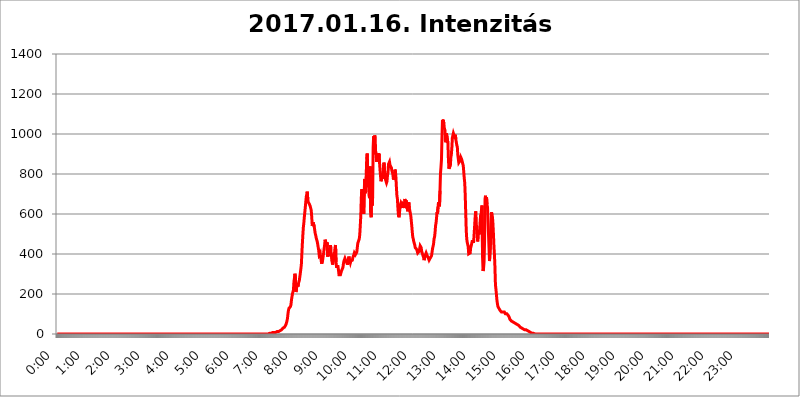
| Category | 2017.01.16. Intenzitás [W/m^2] |
|---|---|
| 0.0 | 0 |
| 0.0006944444444444445 | 0 |
| 0.001388888888888889 | 0 |
| 0.0020833333333333333 | 0 |
| 0.002777777777777778 | 0 |
| 0.003472222222222222 | 0 |
| 0.004166666666666667 | 0 |
| 0.004861111111111111 | 0 |
| 0.005555555555555556 | 0 |
| 0.0062499999999999995 | 0 |
| 0.006944444444444444 | 0 |
| 0.007638888888888889 | 0 |
| 0.008333333333333333 | 0 |
| 0.009027777777777779 | 0 |
| 0.009722222222222222 | 0 |
| 0.010416666666666666 | 0 |
| 0.011111111111111112 | 0 |
| 0.011805555555555555 | 0 |
| 0.012499999999999999 | 0 |
| 0.013194444444444444 | 0 |
| 0.013888888888888888 | 0 |
| 0.014583333333333332 | 0 |
| 0.015277777777777777 | 0 |
| 0.015972222222222224 | 0 |
| 0.016666666666666666 | 0 |
| 0.017361111111111112 | 0 |
| 0.018055555555555557 | 0 |
| 0.01875 | 0 |
| 0.019444444444444445 | 0 |
| 0.02013888888888889 | 0 |
| 0.020833333333333332 | 0 |
| 0.02152777777777778 | 0 |
| 0.022222222222222223 | 0 |
| 0.02291666666666667 | 0 |
| 0.02361111111111111 | 0 |
| 0.024305555555555556 | 0 |
| 0.024999999999999998 | 0 |
| 0.025694444444444447 | 0 |
| 0.02638888888888889 | 0 |
| 0.027083333333333334 | 0 |
| 0.027777777777777776 | 0 |
| 0.02847222222222222 | 0 |
| 0.029166666666666664 | 0 |
| 0.029861111111111113 | 0 |
| 0.030555555555555555 | 0 |
| 0.03125 | 0 |
| 0.03194444444444445 | 0 |
| 0.03263888888888889 | 0 |
| 0.03333333333333333 | 0 |
| 0.034027777777777775 | 0 |
| 0.034722222222222224 | 0 |
| 0.035416666666666666 | 0 |
| 0.036111111111111115 | 0 |
| 0.03680555555555556 | 0 |
| 0.0375 | 0 |
| 0.03819444444444444 | 0 |
| 0.03888888888888889 | 0 |
| 0.03958333333333333 | 0 |
| 0.04027777777777778 | 0 |
| 0.04097222222222222 | 0 |
| 0.041666666666666664 | 0 |
| 0.042361111111111106 | 0 |
| 0.04305555555555556 | 0 |
| 0.043750000000000004 | 0 |
| 0.044444444444444446 | 0 |
| 0.04513888888888889 | 0 |
| 0.04583333333333334 | 0 |
| 0.04652777777777778 | 0 |
| 0.04722222222222222 | 0 |
| 0.04791666666666666 | 0 |
| 0.04861111111111111 | 0 |
| 0.049305555555555554 | 0 |
| 0.049999999999999996 | 0 |
| 0.05069444444444445 | 0 |
| 0.051388888888888894 | 0 |
| 0.052083333333333336 | 0 |
| 0.05277777777777778 | 0 |
| 0.05347222222222222 | 0 |
| 0.05416666666666667 | 0 |
| 0.05486111111111111 | 0 |
| 0.05555555555555555 | 0 |
| 0.05625 | 0 |
| 0.05694444444444444 | 0 |
| 0.057638888888888885 | 0 |
| 0.05833333333333333 | 0 |
| 0.05902777777777778 | 0 |
| 0.059722222222222225 | 0 |
| 0.06041666666666667 | 0 |
| 0.061111111111111116 | 0 |
| 0.06180555555555556 | 0 |
| 0.0625 | 0 |
| 0.06319444444444444 | 0 |
| 0.06388888888888888 | 0 |
| 0.06458333333333334 | 0 |
| 0.06527777777777778 | 0 |
| 0.06597222222222222 | 0 |
| 0.06666666666666667 | 0 |
| 0.06736111111111111 | 0 |
| 0.06805555555555555 | 0 |
| 0.06874999999999999 | 0 |
| 0.06944444444444443 | 0 |
| 0.07013888888888889 | 0 |
| 0.07083333333333333 | 0 |
| 0.07152777777777779 | 0 |
| 0.07222222222222223 | 0 |
| 0.07291666666666667 | 0 |
| 0.07361111111111111 | 0 |
| 0.07430555555555556 | 0 |
| 0.075 | 0 |
| 0.07569444444444444 | 0 |
| 0.0763888888888889 | 0 |
| 0.07708333333333334 | 0 |
| 0.07777777777777778 | 0 |
| 0.07847222222222222 | 0 |
| 0.07916666666666666 | 0 |
| 0.0798611111111111 | 0 |
| 0.08055555555555556 | 0 |
| 0.08125 | 0 |
| 0.08194444444444444 | 0 |
| 0.08263888888888889 | 0 |
| 0.08333333333333333 | 0 |
| 0.08402777777777777 | 0 |
| 0.08472222222222221 | 0 |
| 0.08541666666666665 | 0 |
| 0.08611111111111112 | 0 |
| 0.08680555555555557 | 0 |
| 0.08750000000000001 | 0 |
| 0.08819444444444445 | 0 |
| 0.08888888888888889 | 0 |
| 0.08958333333333333 | 0 |
| 0.09027777777777778 | 0 |
| 0.09097222222222222 | 0 |
| 0.09166666666666667 | 0 |
| 0.09236111111111112 | 0 |
| 0.09305555555555556 | 0 |
| 0.09375 | 0 |
| 0.09444444444444444 | 0 |
| 0.09513888888888888 | 0 |
| 0.09583333333333333 | 0 |
| 0.09652777777777777 | 0 |
| 0.09722222222222222 | 0 |
| 0.09791666666666667 | 0 |
| 0.09861111111111111 | 0 |
| 0.09930555555555555 | 0 |
| 0.09999999999999999 | 0 |
| 0.10069444444444443 | 0 |
| 0.1013888888888889 | 0 |
| 0.10208333333333335 | 0 |
| 0.10277777777777779 | 0 |
| 0.10347222222222223 | 0 |
| 0.10416666666666667 | 0 |
| 0.10486111111111111 | 0 |
| 0.10555555555555556 | 0 |
| 0.10625 | 0 |
| 0.10694444444444444 | 0 |
| 0.1076388888888889 | 0 |
| 0.10833333333333334 | 0 |
| 0.10902777777777778 | 0 |
| 0.10972222222222222 | 0 |
| 0.1111111111111111 | 0 |
| 0.11180555555555556 | 0 |
| 0.11180555555555556 | 0 |
| 0.1125 | 0 |
| 0.11319444444444444 | 0 |
| 0.11388888888888889 | 0 |
| 0.11458333333333333 | 0 |
| 0.11527777777777777 | 0 |
| 0.11597222222222221 | 0 |
| 0.11666666666666665 | 0 |
| 0.1173611111111111 | 0 |
| 0.11805555555555557 | 0 |
| 0.11944444444444445 | 0 |
| 0.12013888888888889 | 0 |
| 0.12083333333333333 | 0 |
| 0.12152777777777778 | 0 |
| 0.12222222222222223 | 0 |
| 0.12291666666666667 | 0 |
| 0.12291666666666667 | 0 |
| 0.12361111111111112 | 0 |
| 0.12430555555555556 | 0 |
| 0.125 | 0 |
| 0.12569444444444444 | 0 |
| 0.12638888888888888 | 0 |
| 0.12708333333333333 | 0 |
| 0.16875 | 0 |
| 0.12847222222222224 | 0 |
| 0.12916666666666668 | 0 |
| 0.12986111111111112 | 0 |
| 0.13055555555555556 | 0 |
| 0.13125 | 0 |
| 0.13194444444444445 | 0 |
| 0.1326388888888889 | 0 |
| 0.13333333333333333 | 0 |
| 0.13402777777777777 | 0 |
| 0.13402777777777777 | 0 |
| 0.13472222222222222 | 0 |
| 0.13541666666666666 | 0 |
| 0.1361111111111111 | 0 |
| 0.13749999999999998 | 0 |
| 0.13819444444444443 | 0 |
| 0.1388888888888889 | 0 |
| 0.13958333333333334 | 0 |
| 0.14027777777777778 | 0 |
| 0.14097222222222222 | 0 |
| 0.14166666666666666 | 0 |
| 0.1423611111111111 | 0 |
| 0.14305555555555557 | 0 |
| 0.14375000000000002 | 0 |
| 0.14444444444444446 | 0 |
| 0.1451388888888889 | 0 |
| 0.1451388888888889 | 0 |
| 0.14652777777777778 | 0 |
| 0.14722222222222223 | 0 |
| 0.14791666666666667 | 0 |
| 0.1486111111111111 | 0 |
| 0.14930555555555555 | 0 |
| 0.15 | 0 |
| 0.15069444444444444 | 0 |
| 0.15138888888888888 | 0 |
| 0.15208333333333332 | 0 |
| 0.15277777777777776 | 0 |
| 0.15347222222222223 | 0 |
| 0.15416666666666667 | 0 |
| 0.15486111111111112 | 0 |
| 0.15555555555555556 | 0 |
| 0.15625 | 0 |
| 0.15694444444444444 | 0 |
| 0.15763888888888888 | 0 |
| 0.15833333333333333 | 0 |
| 0.15902777777777777 | 0 |
| 0.15972222222222224 | 0 |
| 0.16041666666666668 | 0 |
| 0.16111111111111112 | 0 |
| 0.16180555555555556 | 0 |
| 0.1625 | 0 |
| 0.16319444444444445 | 0 |
| 0.1638888888888889 | 0 |
| 0.16458333333333333 | 0 |
| 0.16527777777777777 | 0 |
| 0.16597222222222222 | 0 |
| 0.16666666666666666 | 0 |
| 0.1673611111111111 | 0 |
| 0.16805555555555554 | 0 |
| 0.16874999999999998 | 0 |
| 0.16944444444444443 | 0 |
| 0.17013888888888887 | 0 |
| 0.1708333333333333 | 0 |
| 0.17152777777777775 | 0 |
| 0.17222222222222225 | 0 |
| 0.1729166666666667 | 0 |
| 0.17361111111111113 | 0 |
| 0.17430555555555557 | 0 |
| 0.17500000000000002 | 0 |
| 0.17569444444444446 | 0 |
| 0.1763888888888889 | 0 |
| 0.17708333333333334 | 0 |
| 0.17777777777777778 | 0 |
| 0.17847222222222223 | 0 |
| 0.17916666666666667 | 0 |
| 0.1798611111111111 | 0 |
| 0.18055555555555555 | 0 |
| 0.18125 | 0 |
| 0.18194444444444444 | 0 |
| 0.1826388888888889 | 0 |
| 0.18333333333333335 | 0 |
| 0.1840277777777778 | 0 |
| 0.18472222222222223 | 0 |
| 0.18541666666666667 | 0 |
| 0.18611111111111112 | 0 |
| 0.18680555555555556 | 0 |
| 0.1875 | 0 |
| 0.18819444444444444 | 0 |
| 0.18888888888888888 | 0 |
| 0.18958333333333333 | 0 |
| 0.19027777777777777 | 0 |
| 0.1909722222222222 | 0 |
| 0.19166666666666665 | 0 |
| 0.19236111111111112 | 0 |
| 0.19305555555555554 | 0 |
| 0.19375 | 0 |
| 0.19444444444444445 | 0 |
| 0.1951388888888889 | 0 |
| 0.19583333333333333 | 0 |
| 0.19652777777777777 | 0 |
| 0.19722222222222222 | 0 |
| 0.19791666666666666 | 0 |
| 0.1986111111111111 | 0 |
| 0.19930555555555554 | 0 |
| 0.19999999999999998 | 0 |
| 0.20069444444444443 | 0 |
| 0.20138888888888887 | 0 |
| 0.2020833333333333 | 0 |
| 0.2027777777777778 | 0 |
| 0.2034722222222222 | 0 |
| 0.2041666666666667 | 0 |
| 0.20486111111111113 | 0 |
| 0.20555555555555557 | 0 |
| 0.20625000000000002 | 0 |
| 0.20694444444444446 | 0 |
| 0.2076388888888889 | 0 |
| 0.20833333333333334 | 0 |
| 0.20902777777777778 | 0 |
| 0.20972222222222223 | 0 |
| 0.21041666666666667 | 0 |
| 0.2111111111111111 | 0 |
| 0.21180555555555555 | 0 |
| 0.2125 | 0 |
| 0.21319444444444444 | 0 |
| 0.2138888888888889 | 0 |
| 0.21458333333333335 | 0 |
| 0.2152777777777778 | 0 |
| 0.21597222222222223 | 0 |
| 0.21666666666666667 | 0 |
| 0.21736111111111112 | 0 |
| 0.21805555555555556 | 0 |
| 0.21875 | 0 |
| 0.21944444444444444 | 0 |
| 0.22013888888888888 | 0 |
| 0.22083333333333333 | 0 |
| 0.22152777777777777 | 0 |
| 0.2222222222222222 | 0 |
| 0.22291666666666665 | 0 |
| 0.2236111111111111 | 0 |
| 0.22430555555555556 | 0 |
| 0.225 | 0 |
| 0.22569444444444445 | 0 |
| 0.2263888888888889 | 0 |
| 0.22708333333333333 | 0 |
| 0.22777777777777777 | 0 |
| 0.22847222222222222 | 0 |
| 0.22916666666666666 | 0 |
| 0.2298611111111111 | 0 |
| 0.23055555555555554 | 0 |
| 0.23124999999999998 | 0 |
| 0.23194444444444443 | 0 |
| 0.23263888888888887 | 0 |
| 0.2333333333333333 | 0 |
| 0.2340277777777778 | 0 |
| 0.2347222222222222 | 0 |
| 0.2354166666666667 | 0 |
| 0.23611111111111113 | 0 |
| 0.23680555555555557 | 0 |
| 0.23750000000000002 | 0 |
| 0.23819444444444446 | 0 |
| 0.2388888888888889 | 0 |
| 0.23958333333333334 | 0 |
| 0.24027777777777778 | 0 |
| 0.24097222222222223 | 0 |
| 0.24166666666666667 | 0 |
| 0.2423611111111111 | 0 |
| 0.24305555555555555 | 0 |
| 0.24375 | 0 |
| 0.24444444444444446 | 0 |
| 0.24513888888888888 | 0 |
| 0.24583333333333335 | 0 |
| 0.2465277777777778 | 0 |
| 0.24722222222222223 | 0 |
| 0.24791666666666667 | 0 |
| 0.24861111111111112 | 0 |
| 0.24930555555555556 | 0 |
| 0.25 | 0 |
| 0.25069444444444444 | 0 |
| 0.2513888888888889 | 0 |
| 0.2520833333333333 | 0 |
| 0.25277777777777777 | 0 |
| 0.2534722222222222 | 0 |
| 0.25416666666666665 | 0 |
| 0.2548611111111111 | 0 |
| 0.2555555555555556 | 0 |
| 0.25625000000000003 | 0 |
| 0.2569444444444445 | 0 |
| 0.2576388888888889 | 0 |
| 0.25833333333333336 | 0 |
| 0.2590277777777778 | 0 |
| 0.25972222222222224 | 0 |
| 0.2604166666666667 | 0 |
| 0.2611111111111111 | 0 |
| 0.26180555555555557 | 0 |
| 0.2625 | 0 |
| 0.26319444444444445 | 0 |
| 0.2638888888888889 | 0 |
| 0.26458333333333334 | 0 |
| 0.2652777777777778 | 0 |
| 0.2659722222222222 | 0 |
| 0.26666666666666666 | 0 |
| 0.2673611111111111 | 0 |
| 0.26805555555555555 | 0 |
| 0.26875 | 0 |
| 0.26944444444444443 | 0 |
| 0.2701388888888889 | 0 |
| 0.2708333333333333 | 0 |
| 0.27152777777777776 | 0 |
| 0.2722222222222222 | 0 |
| 0.27291666666666664 | 0 |
| 0.2736111111111111 | 0 |
| 0.2743055555555555 | 0 |
| 0.27499999999999997 | 0 |
| 0.27569444444444446 | 0 |
| 0.27638888888888885 | 0 |
| 0.27708333333333335 | 0 |
| 0.2777777777777778 | 0 |
| 0.27847222222222223 | 0 |
| 0.2791666666666667 | 0 |
| 0.2798611111111111 | 0 |
| 0.28055555555555556 | 0 |
| 0.28125 | 0 |
| 0.28194444444444444 | 0 |
| 0.2826388888888889 | 0 |
| 0.2833333333333333 | 0 |
| 0.28402777777777777 | 0 |
| 0.2847222222222222 | 0 |
| 0.28541666666666665 | 0 |
| 0.28611111111111115 | 0 |
| 0.28680555555555554 | 0 |
| 0.28750000000000003 | 0 |
| 0.2881944444444445 | 0 |
| 0.2888888888888889 | 0 |
| 0.28958333333333336 | 0 |
| 0.2902777777777778 | 0 |
| 0.29097222222222224 | 0 |
| 0.2916666666666667 | 0 |
| 0.2923611111111111 | 0 |
| 0.29305555555555557 | 0 |
| 0.29375 | 0 |
| 0.29444444444444445 | 0 |
| 0.2951388888888889 | 0 |
| 0.29583333333333334 | 0 |
| 0.2965277777777778 | 3.525 |
| 0.2972222222222222 | 3.525 |
| 0.29791666666666666 | 3.525 |
| 0.2986111111111111 | 3.525 |
| 0.29930555555555555 | 3.525 |
| 0.3 | 3.525 |
| 0.30069444444444443 | 3.525 |
| 0.3013888888888889 | 3.525 |
| 0.3020833333333333 | 7.887 |
| 0.30277777777777776 | 7.887 |
| 0.3034722222222222 | 7.887 |
| 0.30416666666666664 | 7.887 |
| 0.3048611111111111 | 7.887 |
| 0.3055555555555555 | 7.887 |
| 0.30624999999999997 | 7.887 |
| 0.3069444444444444 | 12.257 |
| 0.3076388888888889 | 12.257 |
| 0.30833333333333335 | 12.257 |
| 0.3090277777777778 | 12.257 |
| 0.30972222222222223 | 12.257 |
| 0.3104166666666667 | 12.257 |
| 0.3111111111111111 | 12.257 |
| 0.31180555555555556 | 12.257 |
| 0.3125 | 16.636 |
| 0.31319444444444444 | 16.636 |
| 0.3138888888888889 | 16.636 |
| 0.3145833333333333 | 21.024 |
| 0.31527777777777777 | 21.024 |
| 0.3159722222222222 | 25.419 |
| 0.31666666666666665 | 29.823 |
| 0.31736111111111115 | 29.823 |
| 0.31805555555555554 | 29.823 |
| 0.31875000000000003 | 34.234 |
| 0.3194444444444445 | 38.653 |
| 0.3201388888888889 | 38.653 |
| 0.32083333333333336 | 47.511 |
| 0.3215277777777778 | 56.398 |
| 0.32222222222222224 | 65.31 |
| 0.3229166666666667 | 78.722 |
| 0.3236111111111111 | 101.184 |
| 0.32430555555555557 | 119.235 |
| 0.325 | 128.284 |
| 0.32569444444444445 | 128.284 |
| 0.3263888888888889 | 128.284 |
| 0.32708333333333334 | 137.347 |
| 0.3277777777777778 | 146.423 |
| 0.3284722222222222 | 169.156 |
| 0.32916666666666666 | 173.709 |
| 0.3298611111111111 | 201.058 |
| 0.33055555555555555 | 201.058 |
| 0.33125 | 219.309 |
| 0.33194444444444443 | 260.373 |
| 0.3326388888888889 | 278.603 |
| 0.3333333333333333 | 301.354 |
| 0.3340277777777778 | 283.156 |
| 0.3347222222222222 | 210.182 |
| 0.3354166666666667 | 219.309 |
| 0.3361111111111111 | 242.127 |
| 0.3368055555555556 | 251.251 |
| 0.33749999999999997 | 237.564 |
| 0.33819444444444446 | 251.251 |
| 0.33888888888888885 | 255.813 |
| 0.33958333333333335 | 269.49 |
| 0.34027777777777773 | 287.709 |
| 0.34097222222222223 | 305.898 |
| 0.3416666666666666 | 301.354 |
| 0.3423611111111111 | 346.682 |
| 0.3430555555555555 | 400.638 |
| 0.34375 | 449.551 |
| 0.3444444444444445 | 493.475 |
| 0.3451388888888889 | 532.513 |
| 0.3458333333333334 | 553.986 |
| 0.34652777777777777 | 583.779 |
| 0.34722222222222227 | 609.062 |
| 0.34791666666666665 | 634.105 |
| 0.34861111111111115 | 663.019 |
| 0.34930555555555554 | 687.544 |
| 0.35000000000000003 | 699.717 |
| 0.3506944444444444 | 711.832 |
| 0.3513888888888889 | 671.22 |
| 0.3520833333333333 | 658.909 |
| 0.3527777777777778 | 663.019 |
| 0.3534722222222222 | 650.667 |
| 0.3541666666666667 | 650.667 |
| 0.3548611111111111 | 638.256 |
| 0.35555555555555557 | 634.105 |
| 0.35625 | 617.436 |
| 0.35694444444444445 | 583.779 |
| 0.3576388888888889 | 541.121 |
| 0.35833333333333334 | 549.704 |
| 0.3590277777777778 | 558.261 |
| 0.3597222222222222 | 553.986 |
| 0.36041666666666666 | 536.82 |
| 0.3611111111111111 | 532.513 |
| 0.36180555555555555 | 502.192 |
| 0.3625 | 493.475 |
| 0.36319444444444443 | 480.356 |
| 0.3638888888888889 | 475.972 |
| 0.3645833333333333 | 462.786 |
| 0.3652777777777778 | 449.551 |
| 0.3659722222222222 | 445.129 |
| 0.3666666666666667 | 418.492 |
| 0.3673611111111111 | 396.164 |
| 0.3680555555555556 | 400.638 |
| 0.36874999999999997 | 405.108 |
| 0.36944444444444446 | 382.715 |
| 0.37013888888888885 | 369.23 |
| 0.37083333333333335 | 351.198 |
| 0.37152777777777773 | 355.712 |
| 0.37222222222222223 | 369.23 |
| 0.3729166666666666 | 373.729 |
| 0.3736111111111111 | 405.108 |
| 0.3743055555555555 | 427.39 |
| 0.375 | 445.129 |
| 0.3756944444444445 | 471.582 |
| 0.3763888888888889 | 462.786 |
| 0.3770833333333334 | 458.38 |
| 0.37777777777777777 | 440.702 |
| 0.37847222222222227 | 458.38 |
| 0.37916666666666665 | 387.202 |
| 0.37986111111111115 | 387.202 |
| 0.38055555555555554 | 427.39 |
| 0.38125000000000003 | 409.574 |
| 0.3819444444444444 | 400.638 |
| 0.3826388888888889 | 391.685 |
| 0.3833333333333333 | 445.129 |
| 0.3840277777777778 | 387.202 |
| 0.3847222222222222 | 400.638 |
| 0.3854166666666667 | 364.728 |
| 0.3861111111111111 | 346.682 |
| 0.38680555555555557 | 355.712 |
| 0.3875 | 351.198 |
| 0.38819444444444445 | 387.202 |
| 0.3888888888888889 | 405.108 |
| 0.38958333333333334 | 431.833 |
| 0.3902777777777778 | 445.129 |
| 0.3909722222222222 | 360.221 |
| 0.39166666666666666 | 337.639 |
| 0.3923611111111111 | 333.113 |
| 0.39305555555555555 | 337.639 |
| 0.39375 | 337.639 |
| 0.39444444444444443 | 319.517 |
| 0.3951388888888889 | 296.808 |
| 0.3958333333333333 | 296.808 |
| 0.3965277777777778 | 292.259 |
| 0.3972222222222222 | 296.808 |
| 0.3979166666666667 | 301.354 |
| 0.3986111111111111 | 314.98 |
| 0.3993055555555556 | 314.98 |
| 0.39999999999999997 | 319.517 |
| 0.40069444444444446 | 333.113 |
| 0.40138888888888885 | 351.198 |
| 0.40208333333333335 | 364.728 |
| 0.40277777777777773 | 364.728 |
| 0.40347222222222223 | 378.224 |
| 0.4041666666666666 | 373.729 |
| 0.4048611111111111 | 364.728 |
| 0.4055555555555555 | 364.728 |
| 0.40625 | 355.712 |
| 0.4069444444444445 | 346.682 |
| 0.4076388888888889 | 360.221 |
| 0.4083333333333334 | 364.728 |
| 0.40902777777777777 | 387.202 |
| 0.40972222222222227 | 373.729 |
| 0.41041666666666665 | 378.224 |
| 0.41111111111111115 | 355.712 |
| 0.41180555555555554 | 364.728 |
| 0.41250000000000003 | 369.23 |
| 0.4131944444444444 | 364.728 |
| 0.4138888888888889 | 369.23 |
| 0.4145833333333333 | 382.715 |
| 0.4152777777777778 | 387.202 |
| 0.4159722222222222 | 396.164 |
| 0.4166666666666667 | 405.108 |
| 0.4173611111111111 | 405.108 |
| 0.41805555555555557 | 396.164 |
| 0.41875 | 391.685 |
| 0.41944444444444445 | 391.685 |
| 0.4201388888888889 | 409.574 |
| 0.42083333333333334 | 431.833 |
| 0.4215277777777778 | 453.968 |
| 0.4222222222222222 | 458.38 |
| 0.42291666666666666 | 449.551 |
| 0.4236111111111111 | 475.972 |
| 0.42430555555555555 | 497.836 |
| 0.425 | 541.121 |
| 0.42569444444444443 | 588.009 |
| 0.4263888888888889 | 675.311 |
| 0.4270833333333333 | 723.889 |
| 0.4277777777777778 | 727.896 |
| 0.4284722222222222 | 723.889 |
| 0.4291666666666667 | 675.311 |
| 0.4298611111111111 | 600.661 |
| 0.4305555555555556 | 711.832 |
| 0.43124999999999997 | 775.492 |
| 0.43194444444444446 | 703.762 |
| 0.43263888888888885 | 751.803 |
| 0.43333333333333335 | 795.074 |
| 0.43402777777777773 | 875.918 |
| 0.43472222222222223 | 902.447 |
| 0.4354166666666666 | 822.26 |
| 0.4361111111111111 | 787.258 |
| 0.4368055555555555 | 723.889 |
| 0.4375 | 687.544 |
| 0.4381944444444445 | 679.395 |
| 0.4388888888888889 | 837.682 |
| 0.4395833333333334 | 609.062 |
| 0.44027777777777777 | 583.779 |
| 0.44097222222222227 | 719.877 |
| 0.44166666666666665 | 642.4 |
| 0.44236111111111115 | 683.473 |
| 0.44305555555555554 | 932.576 |
| 0.44375000000000003 | 988.714 |
| 0.4444444444444444 | 898.668 |
| 0.4451388888888889 | 992.448 |
| 0.4458333333333333 | 984.98 |
| 0.4465277777777778 | 913.766 |
| 0.4472222222222222 | 902.447 |
| 0.4479166666666667 | 860.676 |
| 0.4486111111111111 | 864.493 |
| 0.44930555555555557 | 887.309 |
| 0.45 | 902.447 |
| 0.45069444444444445 | 894.885 |
| 0.4513888888888889 | 902.447 |
| 0.45208333333333334 | 853.029 |
| 0.4527777777777778 | 818.392 |
| 0.4534722222222222 | 787.258 |
| 0.45416666666666666 | 763.674 |
| 0.4548611111111111 | 775.492 |
| 0.45555555555555555 | 802.868 |
| 0.45625 | 775.492 |
| 0.45694444444444443 | 806.757 |
| 0.4576388888888889 | 841.526 |
| 0.4583333333333333 | 856.855 |
| 0.4590277777777778 | 818.392 |
| 0.4597222222222222 | 791.169 |
| 0.4604166666666667 | 771.559 |
| 0.4611111111111111 | 771.559 |
| 0.4618055555555556 | 755.766 |
| 0.46249999999999997 | 763.674 |
| 0.46319444444444446 | 795.074 |
| 0.46388888888888885 | 806.757 |
| 0.46458333333333335 | 849.199 |
| 0.46527777777777773 | 849.199 |
| 0.46597222222222223 | 860.676 |
| 0.4666666666666666 | 845.365 |
| 0.4673611111111111 | 845.365 |
| 0.4680555555555555 | 845.365 |
| 0.46875 | 829.981 |
| 0.4694444444444445 | 814.519 |
| 0.4701388888888889 | 806.757 |
| 0.4708333333333334 | 795.074 |
| 0.47152777777777777 | 771.559 |
| 0.47222222222222227 | 779.42 |
| 0.47291666666666665 | 791.169 |
| 0.47361111111111115 | 822.26 |
| 0.47430555555555554 | 814.519 |
| 0.47500000000000003 | 783.342 |
| 0.4756944444444444 | 731.896 |
| 0.4763888888888889 | 691.608 |
| 0.4770833333333333 | 675.311 |
| 0.4777777777777778 | 629.948 |
| 0.4784722222222222 | 596.45 |
| 0.4791666666666667 | 583.779 |
| 0.4798611111111111 | 600.661 |
| 0.48055555555555557 | 625.784 |
| 0.48125 | 646.537 |
| 0.48194444444444445 | 654.791 |
| 0.4826388888888889 | 658.909 |
| 0.48333333333333334 | 642.4 |
| 0.4840277777777778 | 629.948 |
| 0.4847222222222222 | 650.667 |
| 0.48541666666666666 | 654.791 |
| 0.4861111111111111 | 654.791 |
| 0.48680555555555555 | 642.4 |
| 0.4875 | 675.311 |
| 0.48819444444444443 | 663.019 |
| 0.4888888888888889 | 629.948 |
| 0.4895833333333333 | 667.123 |
| 0.4902777777777778 | 654.791 |
| 0.4909722222222222 | 625.784 |
| 0.4916666666666667 | 613.252 |
| 0.4923611111111111 | 642.4 |
| 0.4930555555555556 | 658.909 |
| 0.49374999999999997 | 629.948 |
| 0.49444444444444446 | 625.784 |
| 0.49513888888888885 | 625.784 |
| 0.49583333333333335 | 592.233 |
| 0.49652777777777773 | 566.793 |
| 0.49722222222222223 | 541.121 |
| 0.4979166666666666 | 510.885 |
| 0.4986111111111111 | 484.735 |
| 0.4993055555555555 | 475.972 |
| 0.5 | 462.786 |
| 0.5006944444444444 | 462.786 |
| 0.5013888888888889 | 445.129 |
| 0.5020833333333333 | 431.833 |
| 0.5027777777777778 | 436.27 |
| 0.5034722222222222 | 436.27 |
| 0.5041666666666667 | 422.943 |
| 0.5048611111111111 | 414.035 |
| 0.5055555555555555 | 405.108 |
| 0.50625 | 405.108 |
| 0.5069444444444444 | 405.108 |
| 0.5076388888888889 | 414.035 |
| 0.5083333333333333 | 418.492 |
| 0.5090277777777777 | 440.702 |
| 0.5097222222222222 | 445.129 |
| 0.5104166666666666 | 431.833 |
| 0.5111111111111112 | 414.035 |
| 0.5118055555555555 | 405.108 |
| 0.5125000000000001 | 409.574 |
| 0.5131944444444444 | 409.574 |
| 0.513888888888889 | 382.715 |
| 0.5145833333333333 | 369.23 |
| 0.5152777777777778 | 382.715 |
| 0.5159722222222222 | 391.685 |
| 0.5166666666666667 | 391.685 |
| 0.517361111111111 | 405.108 |
| 0.5180555555555556 | 405.108 |
| 0.5187499999999999 | 391.685 |
| 0.5194444444444445 | 387.202 |
| 0.5201388888888888 | 382.715 |
| 0.5208333333333334 | 387.202 |
| 0.5215277777777778 | 369.23 |
| 0.5222222222222223 | 369.23 |
| 0.5229166666666667 | 369.23 |
| 0.5236111111111111 | 382.715 |
| 0.5243055555555556 | 387.202 |
| 0.525 | 391.685 |
| 0.5256944444444445 | 409.574 |
| 0.5263888888888889 | 427.39 |
| 0.5270833333333333 | 427.39 |
| 0.5277777777777778 | 449.551 |
| 0.5284722222222222 | 475.972 |
| 0.5291666666666667 | 484.735 |
| 0.5298611111111111 | 506.542 |
| 0.5305555555555556 | 541.121 |
| 0.53125 | 553.986 |
| 0.5319444444444444 | 579.542 |
| 0.5326388888888889 | 609.062 |
| 0.5333333333333333 | 600.661 |
| 0.5340277777777778 | 634.105 |
| 0.5347222222222222 | 658.909 |
| 0.5354166666666667 | 654.791 |
| 0.5361111111111111 | 638.256 |
| 0.5368055555555555 | 715.858 |
| 0.5375 | 802.868 |
| 0.5381944444444444 | 833.834 |
| 0.5388888888888889 | 872.114 |
| 0.5395833333333333 | 981.244 |
| 0.5402777777777777 | 1071.027 |
| 0.5409722222222222 | 1056.004 |
| 0.5416666666666666 | 1071.027 |
| 0.5423611111111112 | 1037.277 |
| 0.5430555555555555 | 1037.277 |
| 0.5437500000000001 | 1018.587 |
| 0.5444444444444444 | 958.814 |
| 0.545138888888889 | 977.508 |
| 0.5458333333333333 | 1003.65 |
| 0.5465277777777778 | 1007.383 |
| 0.5472222222222222 | 999.916 |
| 0.5479166666666667 | 955.071 |
| 0.548611111111111 | 875.918 |
| 0.5493055555555556 | 826.123 |
| 0.5499999999999999 | 822.26 |
| 0.5506944444444445 | 829.981 |
| 0.5513888888888888 | 845.365 |
| 0.5520833333333334 | 883.516 |
| 0.5527777777777778 | 898.668 |
| 0.5534722222222223 | 932.576 |
| 0.5541666666666667 | 981.244 |
| 0.5548611111111111 | 981.244 |
| 0.5555555555555556 | 1003.65 |
| 0.55625 | 999.916 |
| 0.5569444444444445 | 988.714 |
| 0.5576388888888889 | 977.508 |
| 0.5583333333333333 | 996.182 |
| 0.5590277777777778 | 973.772 |
| 0.5597222222222222 | 958.814 |
| 0.5604166666666667 | 943.832 |
| 0.5611111111111111 | 936.33 |
| 0.5618055555555556 | 894.885 |
| 0.5625 | 875.918 |
| 0.5631944444444444 | 856.855 |
| 0.5638888888888889 | 856.855 |
| 0.5645833333333333 | 864.493 |
| 0.5652777777777778 | 872.114 |
| 0.5659722222222222 | 883.516 |
| 0.5666666666666667 | 887.309 |
| 0.5673611111111111 | 872.114 |
| 0.5680555555555555 | 860.676 |
| 0.56875 | 856.855 |
| 0.5694444444444444 | 841.526 |
| 0.5701388888888889 | 810.641 |
| 0.5708333333333333 | 779.42 |
| 0.5715277777777777 | 755.766 |
| 0.5722222222222222 | 691.608 |
| 0.5729166666666666 | 604.864 |
| 0.5736111111111112 | 519.555 |
| 0.5743055555555555 | 475.972 |
| 0.5750000000000001 | 458.38 |
| 0.5756944444444444 | 458.38 |
| 0.576388888888889 | 436.27 |
| 0.5770833333333333 | 400.638 |
| 0.5777777777777778 | 396.164 |
| 0.5784722222222222 | 396.164 |
| 0.5791666666666667 | 405.108 |
| 0.579861111111111 | 431.833 |
| 0.5805555555555556 | 440.702 |
| 0.5812499999999999 | 436.27 |
| 0.5819444444444445 | 462.786 |
| 0.5826388888888888 | 467.187 |
| 0.5833333333333334 | 467.187 |
| 0.5840277777777778 | 462.786 |
| 0.5847222222222223 | 462.786 |
| 0.5854166666666667 | 541.121 |
| 0.5861111111111111 | 583.779 |
| 0.5868055555555556 | 613.252 |
| 0.5875 | 553.986 |
| 0.5881944444444445 | 536.82 |
| 0.5888888888888889 | 497.836 |
| 0.5895833333333333 | 462.786 |
| 0.5902777777777778 | 489.108 |
| 0.5909722222222222 | 510.885 |
| 0.5916666666666667 | 497.836 |
| 0.5923611111111111 | 519.555 |
| 0.5930555555555556 | 558.261 |
| 0.59375 | 592.233 |
| 0.5944444444444444 | 600.661 |
| 0.5951388888888889 | 625.784 |
| 0.5958333333333333 | 642.4 |
| 0.5965277777777778 | 382.715 |
| 0.5972222222222222 | 314.98 |
| 0.5979166666666667 | 328.584 |
| 0.5986111111111111 | 360.221 |
| 0.5993055555555555 | 458.38 |
| 0.6 | 675.311 |
| 0.6006944444444444 | 691.608 |
| 0.6013888888888889 | 646.537 |
| 0.6020833333333333 | 683.473 |
| 0.6027777777777777 | 646.537 |
| 0.6034722222222222 | 634.105 |
| 0.6041666666666666 | 558.261 |
| 0.6048611111111112 | 497.836 |
| 0.6055555555555555 | 431.833 |
| 0.6062500000000001 | 364.728 |
| 0.6069444444444444 | 360.221 |
| 0.607638888888889 | 453.968 |
| 0.6083333333333333 | 549.704 |
| 0.6090277777777778 | 609.062 |
| 0.6097222222222222 | 596.45 |
| 0.6104166666666667 | 583.779 |
| 0.611111111111111 | 549.704 |
| 0.6118055555555556 | 497.836 |
| 0.6124999999999999 | 436.27 |
| 0.6131944444444445 | 396.164 |
| 0.6138888888888888 | 333.113 |
| 0.6145833333333334 | 246.689 |
| 0.6152777777777778 | 223.873 |
| 0.6159722222222223 | 196.497 |
| 0.6166666666666667 | 169.156 |
| 0.6173611111111111 | 150.964 |
| 0.6180555555555556 | 137.347 |
| 0.61875 | 132.814 |
| 0.6194444444444445 | 128.284 |
| 0.6201388888888889 | 123.758 |
| 0.6208333333333333 | 119.235 |
| 0.6215277777777778 | 119.235 |
| 0.6222222222222222 | 114.716 |
| 0.6229166666666667 | 110.201 |
| 0.6236111111111111 | 110.201 |
| 0.6243055555555556 | 110.201 |
| 0.625 | 110.201 |
| 0.6256944444444444 | 110.201 |
| 0.6263888888888889 | 110.201 |
| 0.6270833333333333 | 110.201 |
| 0.6277777777777778 | 110.201 |
| 0.6284722222222222 | 101.184 |
| 0.6291666666666667 | 101.184 |
| 0.6298611111111111 | 96.682 |
| 0.6305555555555555 | 101.184 |
| 0.63125 | 101.184 |
| 0.6319444444444444 | 96.682 |
| 0.6326388888888889 | 92.184 |
| 0.6333333333333333 | 87.692 |
| 0.6340277777777777 | 83.205 |
| 0.6347222222222222 | 74.246 |
| 0.6354166666666666 | 69.775 |
| 0.6361111111111112 | 69.775 |
| 0.6368055555555555 | 65.31 |
| 0.6375000000000001 | 65.31 |
| 0.6381944444444444 | 60.85 |
| 0.638888888888889 | 60.85 |
| 0.6395833333333333 | 56.398 |
| 0.6402777777777778 | 56.398 |
| 0.6409722222222222 | 56.398 |
| 0.6416666666666667 | 56.398 |
| 0.642361111111111 | 56.398 |
| 0.6430555555555556 | 51.951 |
| 0.6437499999999999 | 51.951 |
| 0.6444444444444445 | 47.511 |
| 0.6451388888888888 | 47.511 |
| 0.6458333333333334 | 47.511 |
| 0.6465277777777778 | 43.079 |
| 0.6472222222222223 | 43.079 |
| 0.6479166666666667 | 38.653 |
| 0.6486111111111111 | 38.653 |
| 0.6493055555555556 | 34.234 |
| 0.65 | 34.234 |
| 0.6506944444444445 | 34.234 |
| 0.6513888888888889 | 29.823 |
| 0.6520833333333333 | 29.823 |
| 0.6527777777777778 | 29.823 |
| 0.6534722222222222 | 25.419 |
| 0.6541666666666667 | 25.419 |
| 0.6548611111111111 | 25.419 |
| 0.6555555555555556 | 21.024 |
| 0.65625 | 21.024 |
| 0.6569444444444444 | 21.024 |
| 0.6576388888888889 | 21.024 |
| 0.6583333333333333 | 16.636 |
| 0.6590277777777778 | 16.636 |
| 0.6597222222222222 | 16.636 |
| 0.6604166666666667 | 12.257 |
| 0.6611111111111111 | 12.257 |
| 0.6618055555555555 | 12.257 |
| 0.6625 | 12.257 |
| 0.6631944444444444 | 12.257 |
| 0.6638888888888889 | 7.887 |
| 0.6645833333333333 | 7.887 |
| 0.6652777777777777 | 7.887 |
| 0.6659722222222222 | 3.525 |
| 0.6666666666666666 | 3.525 |
| 0.6673611111111111 | 3.525 |
| 0.6680555555555556 | 3.525 |
| 0.6687500000000001 | 3.525 |
| 0.6694444444444444 | 3.525 |
| 0.6701388888888888 | 0 |
| 0.6708333333333334 | 3.525 |
| 0.6715277777777778 | 3.525 |
| 0.6722222222222222 | 0 |
| 0.6729166666666666 | 0 |
| 0.6736111111111112 | 0 |
| 0.6743055555555556 | 0 |
| 0.6749999999999999 | 0 |
| 0.6756944444444444 | 0 |
| 0.6763888888888889 | 0 |
| 0.6770833333333334 | 0 |
| 0.6777777777777777 | 0 |
| 0.6784722222222223 | 0 |
| 0.6791666666666667 | 0 |
| 0.6798611111111111 | 0 |
| 0.6805555555555555 | 0 |
| 0.68125 | 0 |
| 0.6819444444444445 | 0 |
| 0.6826388888888889 | 0 |
| 0.6833333333333332 | 0 |
| 0.6840277777777778 | 0 |
| 0.6847222222222222 | 0 |
| 0.6854166666666667 | 0 |
| 0.686111111111111 | 0 |
| 0.6868055555555556 | 0 |
| 0.6875 | 0 |
| 0.6881944444444444 | 0 |
| 0.688888888888889 | 0 |
| 0.6895833333333333 | 0 |
| 0.6902777777777778 | 0 |
| 0.6909722222222222 | 0 |
| 0.6916666666666668 | 0 |
| 0.6923611111111111 | 0 |
| 0.6930555555555555 | 0 |
| 0.69375 | 0 |
| 0.6944444444444445 | 0 |
| 0.6951388888888889 | 0 |
| 0.6958333333333333 | 0 |
| 0.6965277777777777 | 0 |
| 0.6972222222222223 | 0 |
| 0.6979166666666666 | 0 |
| 0.6986111111111111 | 0 |
| 0.6993055555555556 | 0 |
| 0.7000000000000001 | 0 |
| 0.7006944444444444 | 0 |
| 0.7013888888888888 | 0 |
| 0.7020833333333334 | 0 |
| 0.7027777777777778 | 0 |
| 0.7034722222222222 | 0 |
| 0.7041666666666666 | 0 |
| 0.7048611111111112 | 0 |
| 0.7055555555555556 | 0 |
| 0.7062499999999999 | 0 |
| 0.7069444444444444 | 0 |
| 0.7076388888888889 | 0 |
| 0.7083333333333334 | 0 |
| 0.7090277777777777 | 0 |
| 0.7097222222222223 | 0 |
| 0.7104166666666667 | 0 |
| 0.7111111111111111 | 0 |
| 0.7118055555555555 | 0 |
| 0.7125 | 0 |
| 0.7131944444444445 | 0 |
| 0.7138888888888889 | 0 |
| 0.7145833333333332 | 0 |
| 0.7152777777777778 | 0 |
| 0.7159722222222222 | 0 |
| 0.7166666666666667 | 0 |
| 0.717361111111111 | 0 |
| 0.7180555555555556 | 0 |
| 0.71875 | 0 |
| 0.7194444444444444 | 0 |
| 0.720138888888889 | 0 |
| 0.7208333333333333 | 0 |
| 0.7215277777777778 | 0 |
| 0.7222222222222222 | 0 |
| 0.7229166666666668 | 0 |
| 0.7236111111111111 | 0 |
| 0.7243055555555555 | 0 |
| 0.725 | 0 |
| 0.7256944444444445 | 0 |
| 0.7263888888888889 | 0 |
| 0.7270833333333333 | 0 |
| 0.7277777777777777 | 0 |
| 0.7284722222222223 | 0 |
| 0.7291666666666666 | 0 |
| 0.7298611111111111 | 0 |
| 0.7305555555555556 | 0 |
| 0.7312500000000001 | 0 |
| 0.7319444444444444 | 0 |
| 0.7326388888888888 | 0 |
| 0.7333333333333334 | 0 |
| 0.7340277777777778 | 0 |
| 0.7347222222222222 | 0 |
| 0.7354166666666666 | 0 |
| 0.7361111111111112 | 0 |
| 0.7368055555555556 | 0 |
| 0.7374999999999999 | 0 |
| 0.7381944444444444 | 0 |
| 0.7388888888888889 | 0 |
| 0.7395833333333334 | 0 |
| 0.7402777777777777 | 0 |
| 0.7409722222222223 | 0 |
| 0.7416666666666667 | 0 |
| 0.7423611111111111 | 0 |
| 0.7430555555555555 | 0 |
| 0.74375 | 0 |
| 0.7444444444444445 | 0 |
| 0.7451388888888889 | 0 |
| 0.7458333333333332 | 0 |
| 0.7465277777777778 | 0 |
| 0.7472222222222222 | 0 |
| 0.7479166666666667 | 0 |
| 0.748611111111111 | 0 |
| 0.7493055555555556 | 0 |
| 0.75 | 0 |
| 0.7506944444444444 | 0 |
| 0.751388888888889 | 0 |
| 0.7520833333333333 | 0 |
| 0.7527777777777778 | 0 |
| 0.7534722222222222 | 0 |
| 0.7541666666666668 | 0 |
| 0.7548611111111111 | 0 |
| 0.7555555555555555 | 0 |
| 0.75625 | 0 |
| 0.7569444444444445 | 0 |
| 0.7576388888888889 | 0 |
| 0.7583333333333333 | 0 |
| 0.7590277777777777 | 0 |
| 0.7597222222222223 | 0 |
| 0.7604166666666666 | 0 |
| 0.7611111111111111 | 0 |
| 0.7618055555555556 | 0 |
| 0.7625000000000001 | 0 |
| 0.7631944444444444 | 0 |
| 0.7638888888888888 | 0 |
| 0.7645833333333334 | 0 |
| 0.7652777777777778 | 0 |
| 0.7659722222222222 | 0 |
| 0.7666666666666666 | 0 |
| 0.7673611111111112 | 0 |
| 0.7680555555555556 | 0 |
| 0.7687499999999999 | 0 |
| 0.7694444444444444 | 0 |
| 0.7701388888888889 | 0 |
| 0.7708333333333334 | 0 |
| 0.7715277777777777 | 0 |
| 0.7722222222222223 | 0 |
| 0.7729166666666667 | 0 |
| 0.7736111111111111 | 0 |
| 0.7743055555555555 | 0 |
| 0.775 | 0 |
| 0.7756944444444445 | 0 |
| 0.7763888888888889 | 0 |
| 0.7770833333333332 | 0 |
| 0.7777777777777778 | 0 |
| 0.7784722222222222 | 0 |
| 0.7791666666666667 | 0 |
| 0.779861111111111 | 0 |
| 0.7805555555555556 | 0 |
| 0.78125 | 0 |
| 0.7819444444444444 | 0 |
| 0.782638888888889 | 0 |
| 0.7833333333333333 | 0 |
| 0.7840277777777778 | 0 |
| 0.7847222222222222 | 0 |
| 0.7854166666666668 | 0 |
| 0.7861111111111111 | 0 |
| 0.7868055555555555 | 0 |
| 0.7875 | 0 |
| 0.7881944444444445 | 0 |
| 0.7888888888888889 | 0 |
| 0.7895833333333333 | 0 |
| 0.7902777777777777 | 0 |
| 0.7909722222222223 | 0 |
| 0.7916666666666666 | 0 |
| 0.7923611111111111 | 0 |
| 0.7930555555555556 | 0 |
| 0.7937500000000001 | 0 |
| 0.7944444444444444 | 0 |
| 0.7951388888888888 | 0 |
| 0.7958333333333334 | 0 |
| 0.7965277777777778 | 0 |
| 0.7972222222222222 | 0 |
| 0.7979166666666666 | 0 |
| 0.7986111111111112 | 0 |
| 0.7993055555555556 | 0 |
| 0.7999999999999999 | 0 |
| 0.8006944444444444 | 0 |
| 0.8013888888888889 | 0 |
| 0.8020833333333334 | 0 |
| 0.8027777777777777 | 0 |
| 0.8034722222222223 | 0 |
| 0.8041666666666667 | 0 |
| 0.8048611111111111 | 0 |
| 0.8055555555555555 | 0 |
| 0.80625 | 0 |
| 0.8069444444444445 | 0 |
| 0.8076388888888889 | 0 |
| 0.8083333333333332 | 0 |
| 0.8090277777777778 | 0 |
| 0.8097222222222222 | 0 |
| 0.8104166666666667 | 0 |
| 0.811111111111111 | 0 |
| 0.8118055555555556 | 0 |
| 0.8125 | 0 |
| 0.8131944444444444 | 0 |
| 0.813888888888889 | 0 |
| 0.8145833333333333 | 0 |
| 0.8152777777777778 | 0 |
| 0.8159722222222222 | 0 |
| 0.8166666666666668 | 0 |
| 0.8173611111111111 | 0 |
| 0.8180555555555555 | 0 |
| 0.81875 | 0 |
| 0.8194444444444445 | 0 |
| 0.8201388888888889 | 0 |
| 0.8208333333333333 | 0 |
| 0.8215277777777777 | 0 |
| 0.8222222222222223 | 0 |
| 0.8229166666666666 | 0 |
| 0.8236111111111111 | 0 |
| 0.8243055555555556 | 0 |
| 0.8250000000000001 | 0 |
| 0.8256944444444444 | 0 |
| 0.8263888888888888 | 0 |
| 0.8270833333333334 | 0 |
| 0.8277777777777778 | 0 |
| 0.8284722222222222 | 0 |
| 0.8291666666666666 | 0 |
| 0.8298611111111112 | 0 |
| 0.8305555555555556 | 0 |
| 0.8312499999999999 | 0 |
| 0.8319444444444444 | 0 |
| 0.8326388888888889 | 0 |
| 0.8333333333333334 | 0 |
| 0.8340277777777777 | 0 |
| 0.8347222222222223 | 0 |
| 0.8354166666666667 | 0 |
| 0.8361111111111111 | 0 |
| 0.8368055555555555 | 0 |
| 0.8375 | 0 |
| 0.8381944444444445 | 0 |
| 0.8388888888888889 | 0 |
| 0.8395833333333332 | 0 |
| 0.8402777777777778 | 0 |
| 0.8409722222222222 | 0 |
| 0.8416666666666667 | 0 |
| 0.842361111111111 | 0 |
| 0.8430555555555556 | 0 |
| 0.84375 | 0 |
| 0.8444444444444444 | 0 |
| 0.845138888888889 | 0 |
| 0.8458333333333333 | 0 |
| 0.8465277777777778 | 0 |
| 0.8472222222222222 | 0 |
| 0.8479166666666668 | 0 |
| 0.8486111111111111 | 0 |
| 0.8493055555555555 | 0 |
| 0.85 | 0 |
| 0.8506944444444445 | 0 |
| 0.8513888888888889 | 0 |
| 0.8520833333333333 | 0 |
| 0.8527777777777777 | 0 |
| 0.8534722222222223 | 0 |
| 0.8541666666666666 | 0 |
| 0.8548611111111111 | 0 |
| 0.8555555555555556 | 0 |
| 0.8562500000000001 | 0 |
| 0.8569444444444444 | 0 |
| 0.8576388888888888 | 0 |
| 0.8583333333333334 | 0 |
| 0.8590277777777778 | 0 |
| 0.8597222222222222 | 0 |
| 0.8604166666666666 | 0 |
| 0.8611111111111112 | 0 |
| 0.8618055555555556 | 0 |
| 0.8624999999999999 | 0 |
| 0.8631944444444444 | 0 |
| 0.8638888888888889 | 0 |
| 0.8645833333333334 | 0 |
| 0.8652777777777777 | 0 |
| 0.8659722222222223 | 0 |
| 0.8666666666666667 | 0 |
| 0.8673611111111111 | 0 |
| 0.8680555555555555 | 0 |
| 0.86875 | 0 |
| 0.8694444444444445 | 0 |
| 0.8701388888888889 | 0 |
| 0.8708333333333332 | 0 |
| 0.8715277777777778 | 0 |
| 0.8722222222222222 | 0 |
| 0.8729166666666667 | 0 |
| 0.873611111111111 | 0 |
| 0.8743055555555556 | 0 |
| 0.875 | 0 |
| 0.8756944444444444 | 0 |
| 0.876388888888889 | 0 |
| 0.8770833333333333 | 0 |
| 0.8777777777777778 | 0 |
| 0.8784722222222222 | 0 |
| 0.8791666666666668 | 0 |
| 0.8798611111111111 | 0 |
| 0.8805555555555555 | 0 |
| 0.88125 | 0 |
| 0.8819444444444445 | 0 |
| 0.8826388888888889 | 0 |
| 0.8833333333333333 | 0 |
| 0.8840277777777777 | 0 |
| 0.8847222222222223 | 0 |
| 0.8854166666666666 | 0 |
| 0.8861111111111111 | 0 |
| 0.8868055555555556 | 0 |
| 0.8875000000000001 | 0 |
| 0.8881944444444444 | 0 |
| 0.8888888888888888 | 0 |
| 0.8895833333333334 | 0 |
| 0.8902777777777778 | 0 |
| 0.8909722222222222 | 0 |
| 0.8916666666666666 | 0 |
| 0.8923611111111112 | 0 |
| 0.8930555555555556 | 0 |
| 0.8937499999999999 | 0 |
| 0.8944444444444444 | 0 |
| 0.8951388888888889 | 0 |
| 0.8958333333333334 | 0 |
| 0.8965277777777777 | 0 |
| 0.8972222222222223 | 0 |
| 0.8979166666666667 | 0 |
| 0.8986111111111111 | 0 |
| 0.8993055555555555 | 0 |
| 0.9 | 0 |
| 0.9006944444444445 | 0 |
| 0.9013888888888889 | 0 |
| 0.9020833333333332 | 0 |
| 0.9027777777777778 | 0 |
| 0.9034722222222222 | 0 |
| 0.9041666666666667 | 0 |
| 0.904861111111111 | 0 |
| 0.9055555555555556 | 0 |
| 0.90625 | 0 |
| 0.9069444444444444 | 0 |
| 0.907638888888889 | 0 |
| 0.9083333333333333 | 0 |
| 0.9090277777777778 | 0 |
| 0.9097222222222222 | 0 |
| 0.9104166666666668 | 0 |
| 0.9111111111111111 | 0 |
| 0.9118055555555555 | 0 |
| 0.9125 | 0 |
| 0.9131944444444445 | 0 |
| 0.9138888888888889 | 0 |
| 0.9145833333333333 | 0 |
| 0.9152777777777777 | 0 |
| 0.9159722222222223 | 0 |
| 0.9166666666666666 | 0 |
| 0.9173611111111111 | 0 |
| 0.9180555555555556 | 0 |
| 0.9187500000000001 | 0 |
| 0.9194444444444444 | 0 |
| 0.9201388888888888 | 0 |
| 0.9208333333333334 | 0 |
| 0.9215277777777778 | 0 |
| 0.9222222222222222 | 0 |
| 0.9229166666666666 | 0 |
| 0.9236111111111112 | 0 |
| 0.9243055555555556 | 0 |
| 0.9249999999999999 | 0 |
| 0.9256944444444444 | 0 |
| 0.9263888888888889 | 0 |
| 0.9270833333333334 | 0 |
| 0.9277777777777777 | 0 |
| 0.9284722222222223 | 0 |
| 0.9291666666666667 | 0 |
| 0.9298611111111111 | 0 |
| 0.9305555555555555 | 0 |
| 0.93125 | 0 |
| 0.9319444444444445 | 0 |
| 0.9326388888888889 | 0 |
| 0.9333333333333332 | 0 |
| 0.9340277777777778 | 0 |
| 0.9347222222222222 | 0 |
| 0.9354166666666667 | 0 |
| 0.936111111111111 | 0 |
| 0.9368055555555556 | 0 |
| 0.9375 | 0 |
| 0.9381944444444444 | 0 |
| 0.938888888888889 | 0 |
| 0.9395833333333333 | 0 |
| 0.9402777777777778 | 0 |
| 0.9409722222222222 | 0 |
| 0.9416666666666668 | 0 |
| 0.9423611111111111 | 0 |
| 0.9430555555555555 | 0 |
| 0.94375 | 0 |
| 0.9444444444444445 | 0 |
| 0.9451388888888889 | 0 |
| 0.9458333333333333 | 0 |
| 0.9465277777777777 | 0 |
| 0.9472222222222223 | 0 |
| 0.9479166666666666 | 0 |
| 0.9486111111111111 | 0 |
| 0.9493055555555556 | 0 |
| 0.9500000000000001 | 0 |
| 0.9506944444444444 | 0 |
| 0.9513888888888888 | 0 |
| 0.9520833333333334 | 0 |
| 0.9527777777777778 | 0 |
| 0.9534722222222222 | 0 |
| 0.9541666666666666 | 0 |
| 0.9548611111111112 | 0 |
| 0.9555555555555556 | 0 |
| 0.9562499999999999 | 0 |
| 0.9569444444444444 | 0 |
| 0.9576388888888889 | 0 |
| 0.9583333333333334 | 0 |
| 0.9590277777777777 | 0 |
| 0.9597222222222223 | 0 |
| 0.9604166666666667 | 0 |
| 0.9611111111111111 | 0 |
| 0.9618055555555555 | 0 |
| 0.9625 | 0 |
| 0.9631944444444445 | 0 |
| 0.9638888888888889 | 0 |
| 0.9645833333333332 | 0 |
| 0.9652777777777778 | 0 |
| 0.9659722222222222 | 0 |
| 0.9666666666666667 | 0 |
| 0.967361111111111 | 0 |
| 0.9680555555555556 | 0 |
| 0.96875 | 0 |
| 0.9694444444444444 | 0 |
| 0.970138888888889 | 0 |
| 0.9708333333333333 | 0 |
| 0.9715277777777778 | 0 |
| 0.9722222222222222 | 0 |
| 0.9729166666666668 | 0 |
| 0.9736111111111111 | 0 |
| 0.9743055555555555 | 0 |
| 0.975 | 0 |
| 0.9756944444444445 | 0 |
| 0.9763888888888889 | 0 |
| 0.9770833333333333 | 0 |
| 0.9777777777777777 | 0 |
| 0.9784722222222223 | 0 |
| 0.9791666666666666 | 0 |
| 0.9798611111111111 | 0 |
| 0.9805555555555556 | 0 |
| 0.9812500000000001 | 0 |
| 0.9819444444444444 | 0 |
| 0.9826388888888888 | 0 |
| 0.9833333333333334 | 0 |
| 0.9840277777777778 | 0 |
| 0.9847222222222222 | 0 |
| 0.9854166666666666 | 0 |
| 0.9861111111111112 | 0 |
| 0.9868055555555556 | 0 |
| 0.9874999999999999 | 0 |
| 0.9881944444444444 | 0 |
| 0.9888888888888889 | 0 |
| 0.9895833333333334 | 0 |
| 0.9902777777777777 | 0 |
| 0.9909722222222223 | 0 |
| 0.9916666666666667 | 0 |
| 0.9923611111111111 | 0 |
| 0.9930555555555555 | 0 |
| 0.99375 | 0 |
| 0.9944444444444445 | 0 |
| 0.9951388888888889 | 0 |
| 0.9958333333333332 | 0 |
| 0.9965277777777778 | 0 |
| 0.9972222222222222 | 0 |
| 0.9979166666666667 | 0 |
| 0.998611111111111 | 0 |
| 0.9993055555555556 | 0 |